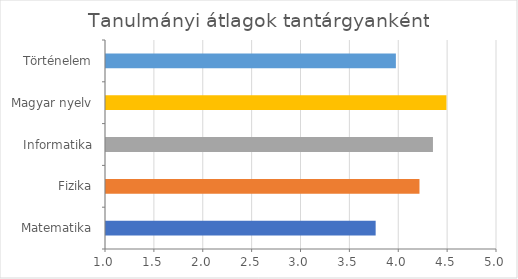
| Category | Series 0 |
|---|---|
| Matematika | 3.759 |
| Fizika | 4.207 |
| Informatika | 4.345 |
| Magyar nyelv | 4.483 |
| Történelem | 3.966 |